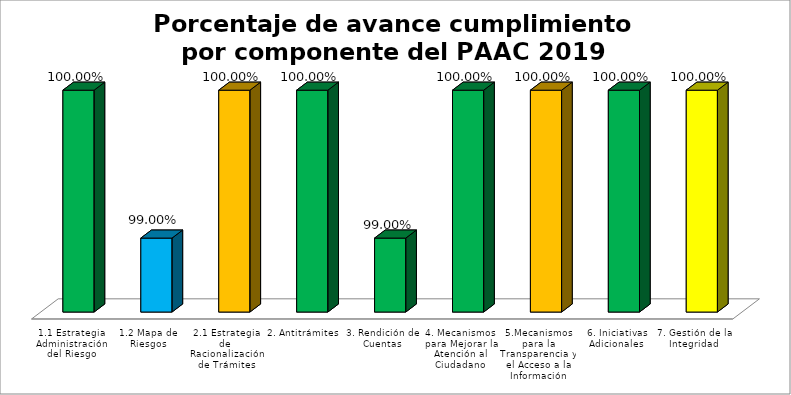
| Category | Series 0 |
|---|---|
| 1.1 Estrategia Administración del Riesgo | 1 |
| 1.2 Mapa de Riesgos | 0.99 |
| 2.1 Estrategia de  Racionalización de Trámites | 1 |
| 2. Antitrámites | 1 |
| 3. Rendición de Cuentas | 0.99 |
| 4. Mecanismos para Mejorar la Atención al Ciudadano | 1 |
| 5.Mecanismos para la Transparencia y el Acceso a la Información | 1 |
| 6. Iniciativas Adicionales | 1 |
| 7. Gestión de la Integridad  | 1 |